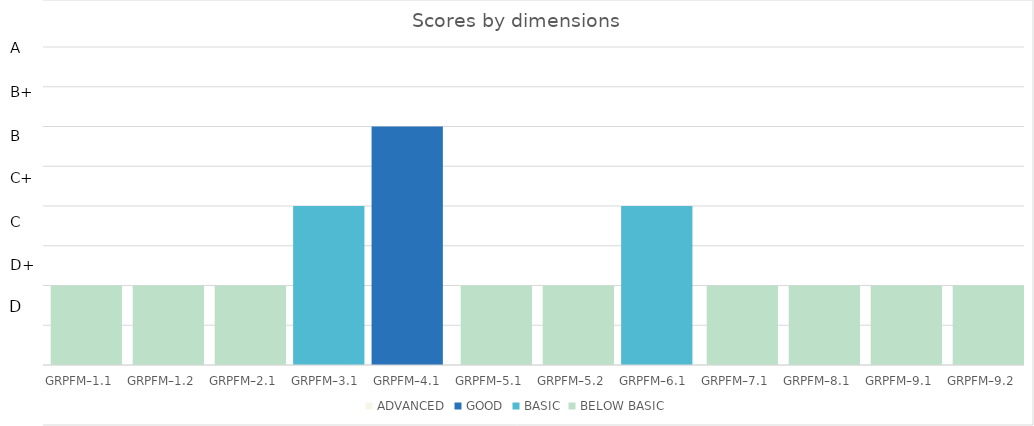
| Category | ADVANCED | GOOD | BASIC | BELOW BASIC |
|---|---|---|---|---|
| GRPFM–1.1 | 0 | 0 | 0 | 1 |
| GRPFM–1.2 | 0 | 0 | 0 | 1 |
| GRPFM–2.1 | 0 | 0 | 0 | 1 |
| GRPFM–3.1 | 0 | 0 | 2 | 0 |
| GRPFM–4.1 | 0 | 3 | 0 | 0 |
| GRPFM–5.1 | 0 | 0 | 0 | 1 |
| GRPFM–5.2 | 0 | 0 | 0 | 1 |
| GRPFM–6.1 | 0 | 0 | 2 | 0 |
| GRPFM–7.1 | 0 | 0 | 0 | 1 |
| GRPFM–8.1 | 0 | 0 | 0 | 1 |
| GRPFM–9.1 | 0 | 0 | 0 | 1 |
| GRPFM–9.2 | 0 | 0 | 0 | 1 |